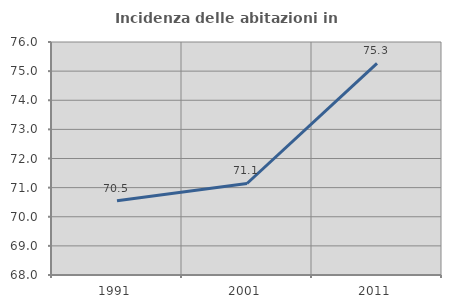
| Category | Incidenza delle abitazioni in proprietà  |
|---|---|
| 1991.0 | 70.546 |
| 2001.0 | 71.142 |
| 2011.0 | 75.269 |